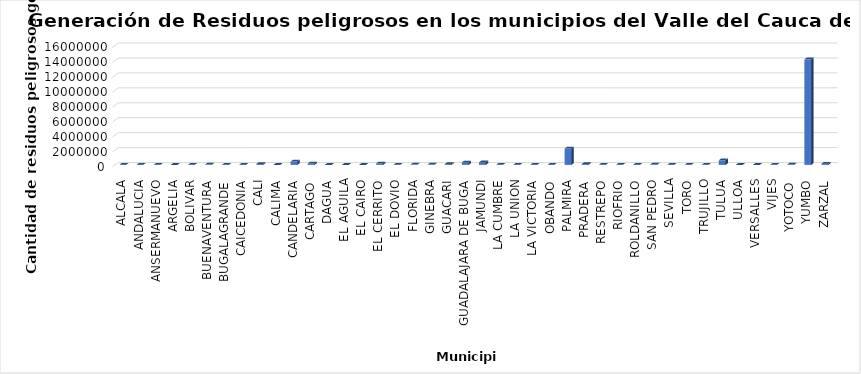
| Category | Series 0 |
|---|---|
| ALCALA | 4315.5 |
| ANDALUCIA | 6143.17 |
| ANSERMANUEVO | 4397.4 |
| ARGELIA | 1073.75 |
| BOLIVAR | 2330 |
| BUENAVENTURA | 35659 |
| BUGALAGRANDE | 24374.33 |
| CAICEDONIA | 19066.59 |
| CALI | 119545.1 |
| CALIMA | 0 |
| CANDELARIA | 443663.78 |
| CARTAGO | 183406.82 |
| DAGUA | 901.85 |
| EL AGUILA | 1068 |
| EL CAIRO | 960.33 |
| EL CERRITO | 193268.08 |
| EL DOVIO | 2397 |
| FLORIDA | 37980.16 |
| GINEBRA | 42460.02 |
| GUACARI | 100774.97 |
| GUADALAJARA DE BUGA | 326503.14 |
| JAMUNDI | 333121.03 |
| LA CUMBRE | 2333.12 |
| LA UNION | 13930.35 |
| LA VICTORIA | 18118.37 |
| OBANDO | 5633.97 |
| PALMIRA | 2186839.64 |
| PRADERA | 118358.08 |
| RESTREPO | 8462.5 |
| RIOFRIO | 3790.8 |
| ROLDANILLO | 18173.17 |
| SAN PEDRO | 50960.98 |
| SEVILLA | 17607.39 |
| TORO | 2134.3 |
| TRUJILLO | 6190.9 |
| TULUA | 606729.48 |
| ULLOA | 793.5 |
| VERSALLES | 1508.7 |
| VIJES | 2138.66 |
| YOTOCO | 50036.2 |
| YUMBO | 14119689.02 |
| ZARZAL | 163343.6 |